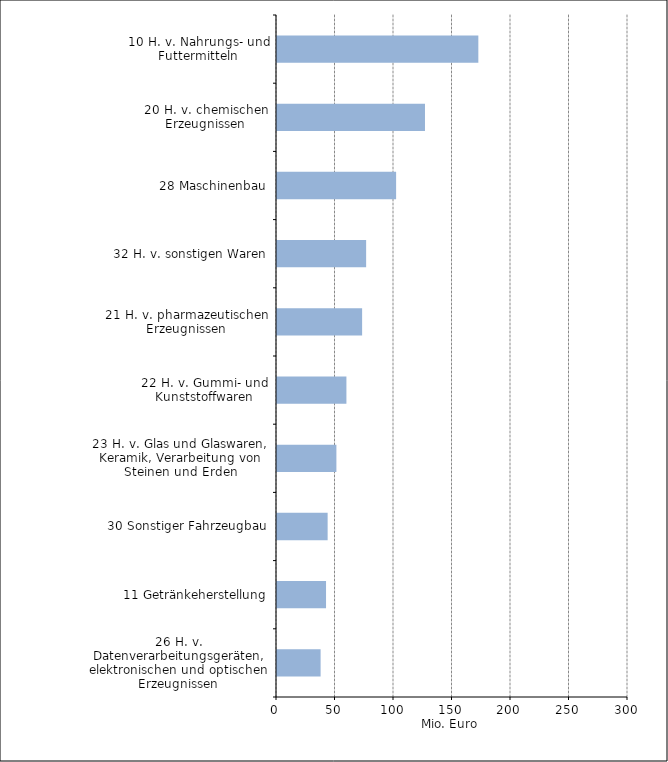
| Category | Mio. Euro |
|---|---|
| 10 H. v. Nahrungs- und Futtermitteln | 172.087 |
| 20 H. v. chemischen Erzeugnissen | 126.479 |
| 28 Maschinenbau | 101.805 |
| 32 H. v. sonstigen Waren | 76.183 |
| 21 H. v. pharmazeutischen Erzeugnissen | 72.752 |
| 22 H. v. Gummi- und Kunststoffwaren | 59.326 |
| 23 H. v. Glas und Glaswaren, Keramik, Verarbeitung von Steinen und Erden | 50.77 |
| 30 Sonstiger Fahrzeugbau | 43.277 |
| 11 Getränkeherstellung | 41.912 |
| 26 H. v. Datenverarbeitungsgeräten, elektronischen und optischen Erzeugnissen | 37.265 |